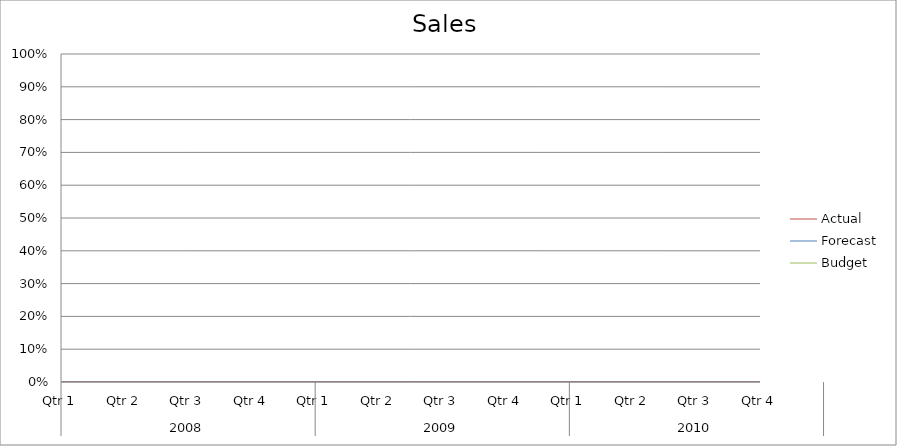
| Category | Budget | Forecast | Actual |
|---|---|---|---|
| 0 | 2930 | 1300 | 3360 |
| 1 | 1540 | 970 | 2110 |
| 2 | 2970 | 1000 | 2350 |
| 3 | 2370 | 1170 | 690 |
| 4 | 1080 | 2930 | 3190 |
| 5 | 720 | 1850 | 1450 |
| 6 | 2300 | 2580 | 1240 |
| 7 | 2090 | 1520 | 2720 |
| 8 | 2800 | 3040 | 1930 |
| 9 | 3060 | 2870 | 2430 |
| 10 | 3100 | 790 | 800 |
| 11 | 2990 | 1780 | 2670 |